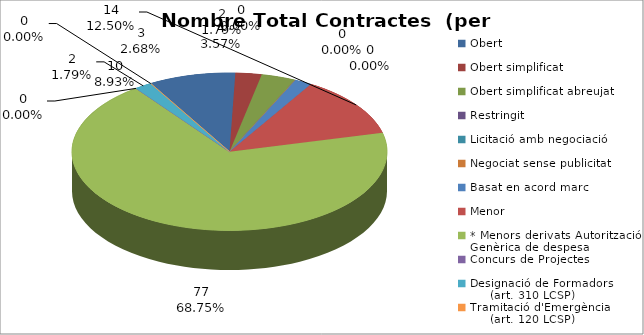
| Category | Nombre Total Contractes |
|---|---|
| Obert | 10 |
| Obert simplificat | 3 |
| Obert simplificat abreujat | 4 |
| Restringit | 0 |
| Licitació amb negociació | 0 |
| Negociat sense publicitat | 0 |
| Basat en acord marc | 2 |
| Menor | 14 |
| * Menors derivats Autorització Genèrica de despesa | 77 |
| Concurs de Projectes | 0 |
| Designació de Formadors
     (art. 310 LCSP) | 2 |
| Tramitació d'Emergència
     (art. 120 LCSP) | 0 |